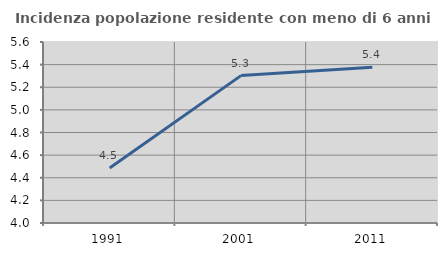
| Category | Incidenza popolazione residente con meno di 6 anni |
|---|---|
| 1991.0 | 4.486 |
| 2001.0 | 5.303 |
| 2011.0 | 5.377 |